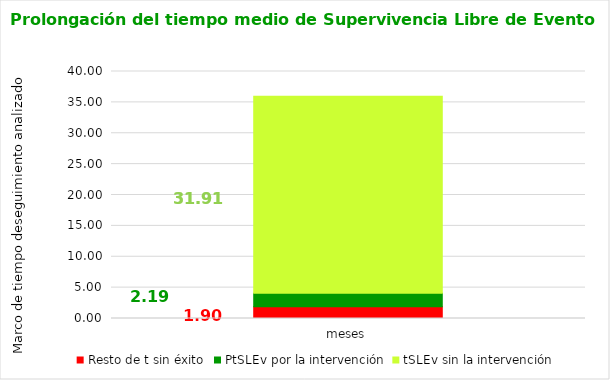
| Category | Resto de t sin éxito | PtSLEv por la intervención | tSLEv sin la intervención |
|---|---|---|---|
| meses | 1.901 | 2.188 | 31.911 |